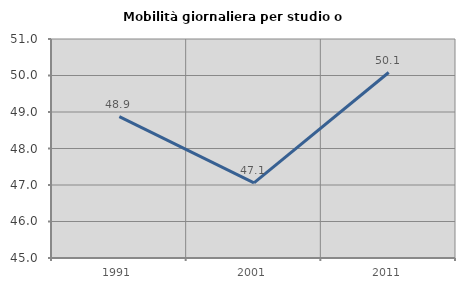
| Category | Mobilità giornaliera per studio o lavoro |
|---|---|
| 1991.0 | 48.873 |
| 2001.0 | 47.059 |
| 2011.0 | 50.081 |